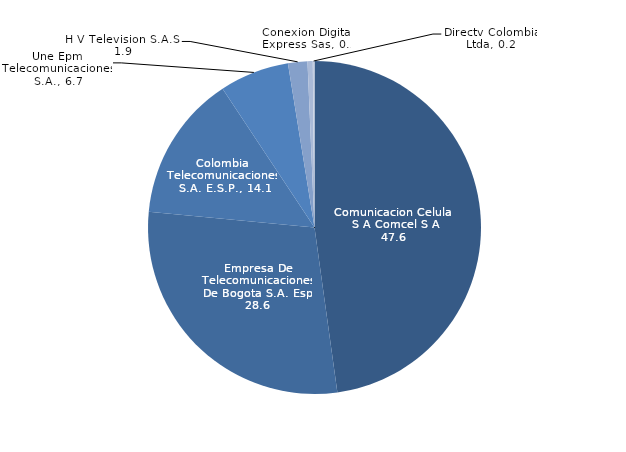
| Category | Series 2 |
|---|---|
| Comunicacion Celular S A Comcel S A | 47.578 |
| Empresa De Telecomunicaciones De Bogota S.A. Esp | 28.574 |
| Colombia Telecomunicaciones S.A. E.S.P. | 14.108 |
| Une Epm Telecomunicaciones S.A. | 6.724 |
| H V Television S.A.S. | 1.873 |
| Conexion Digital Express Sas | 0.505 |
| Directv Colombia Ltda | 0.164 |